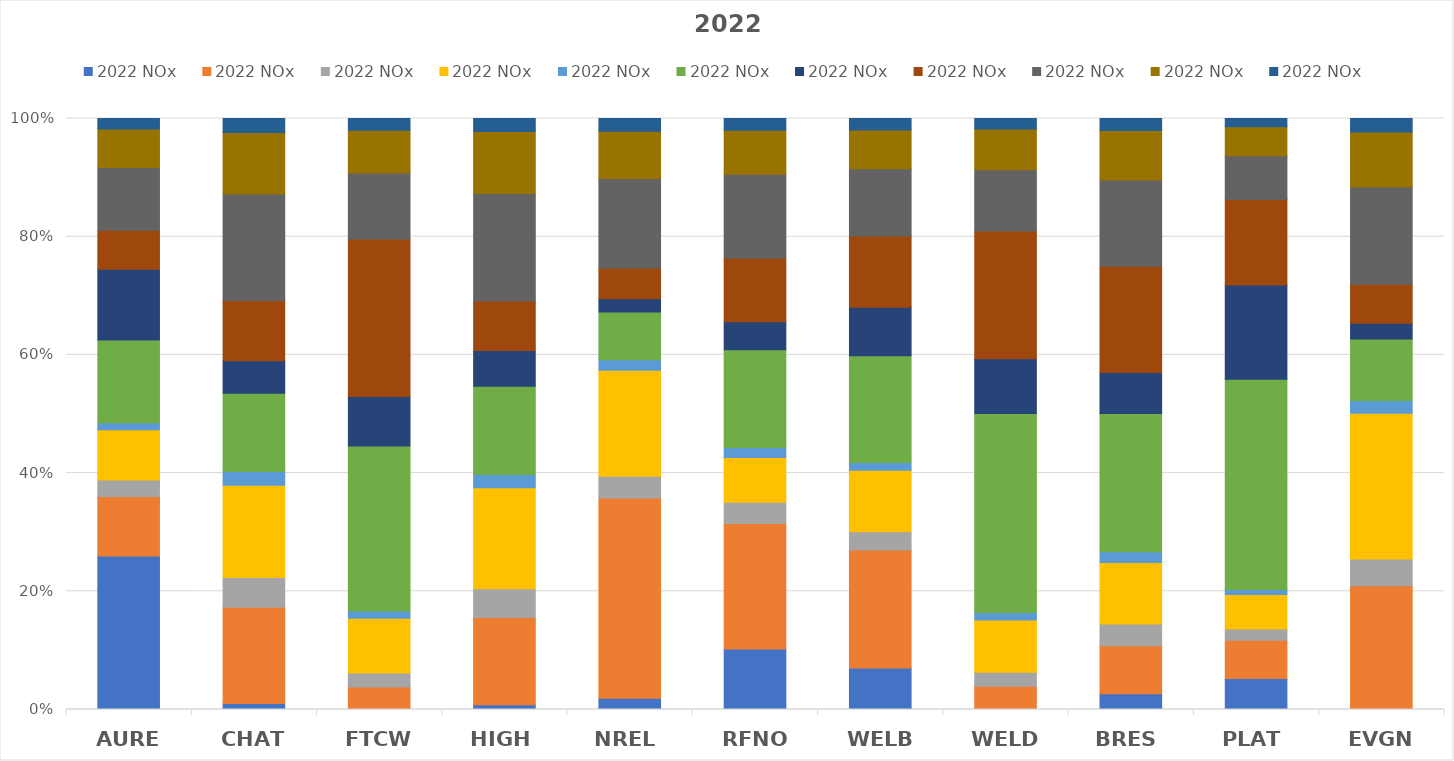
| Category | Airports | EGU Point | Lawn & Garden Equipment | Non-EGU Point | Nonpoint | O&G Area | O&G Point | O&G pre-production | On-road Mobile | Other Non-road Mobile | Rail |
|---|---|---|---|---|---|---|---|---|---|---|---|
| AURE | 182.767 | 70.751 | 19.65 | 59.923 | 8.295 | 98.61 | 84.256 | 46.461 | 74.503 | 45.805 | 12.619 |
| CHAT | 34.748 | 569.324 | 175.304 | 544.627 | 81.546 | 462.21 | 192.112 | 356.052 | 628.457 | 363.543 | 82.05 |
| FTCW | 1.973 | 55.697 | 36.108 | 140.483 | 18.849 | 423.688 | 127.05 | 404.372 | 169.103 | 110.179 | 29.884 |
| HIGH | 21.798 | 397.33 | 131.018 | 459.936 | 60.45 | 401.192 | 163.256 | 225.648 | 489.723 | 282.455 | 58.816 |
| NREL | 147.147 | 2645.315 | 285.288 | 1398.66 | 139.412 | 630.89 | 174.433 | 405.693 | 1183.127 | 621.425 | 169.261 |
| RFNO | 440.747 | 914.646 | 154.936 | 325.763 | 72.447 | 713.275 | 204.025 | 462.786 | 613.002 | 319.421 | 85.974 |
| WELB | 267.344 | 760.118 | 117.631 | 396.786 | 48.64 | 688.631 | 312.635 | 457.96 | 433.886 | 249.301 | 74.175 |
| WELD | 1.024 | 27.711 | 17.45 | 65.017 | 9.106 | 247.25 | 67.809 | 158.746 | 76.036 | 50.484 | 13.13 |
| BRES | 42.366 | 130.259 | 59.251 | 166.487 | 29.183 | 374.086 | 111.134 | 287.727 | 233.363 | 134.45 | 32.216 |
| PLAT | 108.327 | 134.388 | 39.978 | 120.447 | 17.916 | 736.822 | 330.515 | 300.191 | 153.338 | 101.303 | 29.005 |
| EVGN | 2.481 | 587.582 | 127.685 | 696.265 | 60.122 | 293.568 | 76.102 | 185.059 | 464.526 | 262.657 | 64.418 |